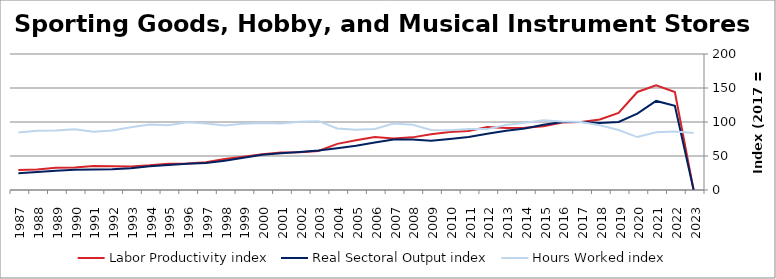
| Category | Labor Productivity index | Real Sectoral Output index | Hours Worked index |
|---|---|---|---|
| 2023.0 | 0 | 0 | 83.849 |
| 2022.0 | 144.102 | 123.938 | 86.007 |
| 2021.0 | 154.134 | 131.004 | 84.993 |
| 2020.0 | 144.179 | 112.21 | 77.827 |
| 2019.0 | 113.442 | 99.996 | 88.147 |
| 2018.0 | 103.73 | 98.618 | 95.072 |
| 2017.0 | 100 | 100 | 100 |
| 2016.0 | 99.257 | 99.928 | 100.676 |
| 2015.0 | 93.697 | 96.059 | 102.522 |
| 2014.0 | 91.644 | 90.542 | 98.798 |
| 2013.0 | 91.145 | 87.15 | 95.616 |
| 2012.0 | 92.463 | 82.797 | 89.546 |
| 2011.0 | 86.851 | 77.897 | 89.69 |
| 2010.0 | 85.395 | 74.956 | 87.775 |
| 2009.0 | 82.038 | 72.48 | 88.35 |
| 2008.0 | 77.401 | 74.405 | 96.129 |
| 2007.0 | 75.92 | 74.167 | 97.69 |
| 2006.0 | 77.889 | 69.847 | 89.675 |
| 2005.0 | 73.245 | 64.956 | 88.684 |
| 2004.0 | 67.856 | 61.416 | 90.509 |
| 2003.0 | 57.392 | 58.102 | 101.237 |
| 2002.0 | 55.635 | 55.837 | 100.362 |
| 2001.0 | 55.035 | 53.882 | 97.906 |
| 2000.0 | 52.618 | 51.83 | 98.501 |
| 1999.0 | 48.815 | 47.525 | 97.357 |
| 1998.0 | 45.435 | 43.075 | 94.804 |
| 1997.0 | 40.795 | 39.87 | 97.731 |
| 1996.0 | 38.885 | 38.705 | 99.537 |
| 1995.0 | 38.568 | 36.679 | 95.102 |
| 1994.0 | 36.315 | 35.028 | 96.456 |
| 1993.0 | 34.71 | 32.029 | 92.277 |
| 1992.0 | 34.771 | 30.399 | 87.424 |
| 1991.0 | 35.348 | 30.239 | 85.548 |
| 1990.0 | 33.15 | 29.605 | 89.305 |
| 1989.0 | 32.617 | 28.484 | 87.33 |
| 1988.0 | 30.285 | 26.389 | 87.134 |
| 1987.0 | 29.275 | 24.764 | 84.591 |